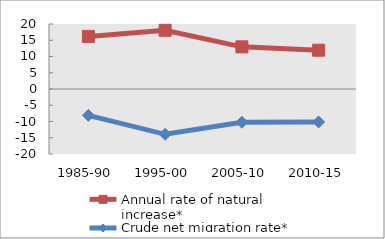
| Category | Annual rate of natural increase* | Crude net migration rate* |
|---|---|---|
| 1985-90 | 16.179 | -8.112 |
| 1995-00 | 18.063 | -13.944 |
| 2005-10 | 12.97 | -10.245 |
| 2010-15 | 11.934 | -10.13 |